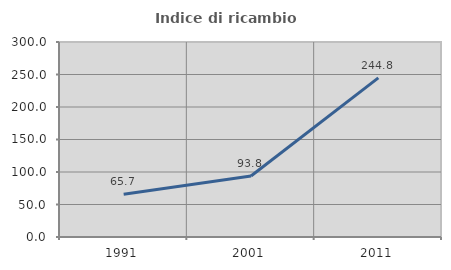
| Category | Indice di ricambio occupazionale  |
|---|---|
| 1991.0 | 65.651 |
| 2001.0 | 93.772 |
| 2011.0 | 244.809 |